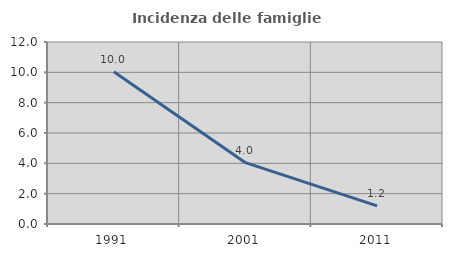
| Category | Incidenza delle famiglie numerose |
|---|---|
| 1991.0 | 10.04 |
| 2001.0 | 4.045 |
| 2011.0 | 1.19 |